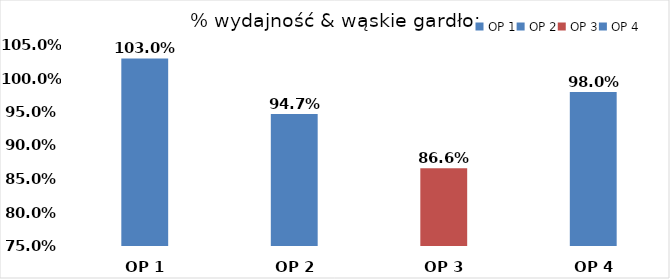
| Category | % Wypełnienia normy - zmiana |
|---|---|
| OP 1 | 1.03 |
| OP 2 | 0.947 |
| OP 3 | 0.866 |
| OP 4 | 0.98 |